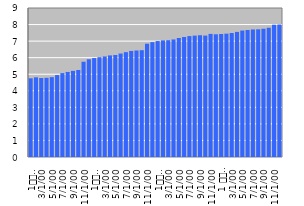
| Category | FX savings |
|---|---|
| 1
2009 | 4.753 |
| 2 | 4.812 |
| 3 | 4.77 |
| 4 | 4.783 |
| 5 | 4.822 |
| 6 | 4.949 |
| 7 | 5.068 |
| 8 | 5.136 |
| 9 | 5.202 |
| 10 | 5.257 |
| 11 | 5.755 |
| 12 | 5.905 |
| 1
2010 | 5.977 |
| 2 | 6.029 |
| 3 | 6.072 |
| 4 | 6.135 |
| 5 | 6.163 |
| 6 | 6.249 |
| 7 | 6.334 |
| 8 | 6.407 |
| 9 | 6.432 |
| 10 | 6.452 |
| 11 | 6.843 |
| 12 | 6.939 |
| 1
2011 | 7.004 |
| 2 | 7.045 |
| 3 | 7.055 |
| 4 | 7.099 |
| 5 | 7.189 |
| 6 | 7.247 |
| 7 | 7.304 |
| 8 | 7.331 |
| 9 | 7.355 |
| 10 | 7.334 |
| 11 | 7.435 |
| 12 | 7.412 |
| 1 
2012 | 7.43 |
| 2 | 7.449 |
| 3 | 7.491 |
| 4 | 7.555 |
| 5 | 7.638 |
| 6 | 7.67 |
| 7 | 7.704 |
| 8 | 7.713 |
| 9 | 7.744 |
| 10 | 7.801 |
| 11 | 7.984 |
| 12 | 8.001 |